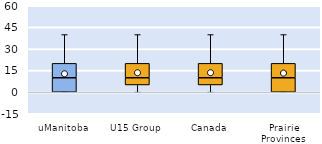
| Category | 25th | 50th | 75th |
|---|---|---|---|
| uManitoba | 0 | 10 | 10 |
| U15 Group | 5 | 5 | 10 |
| Canada | 5 | 5 | 10 |
| Prairie Provinces | 0 | 10 | 10 |